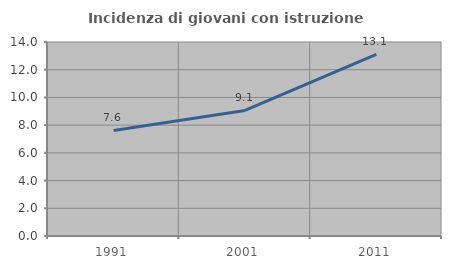
| Category | Incidenza di giovani con istruzione universitaria |
|---|---|
| 1991.0 | 7.619 |
| 2001.0 | 9.059 |
| 2011.0 | 13.107 |